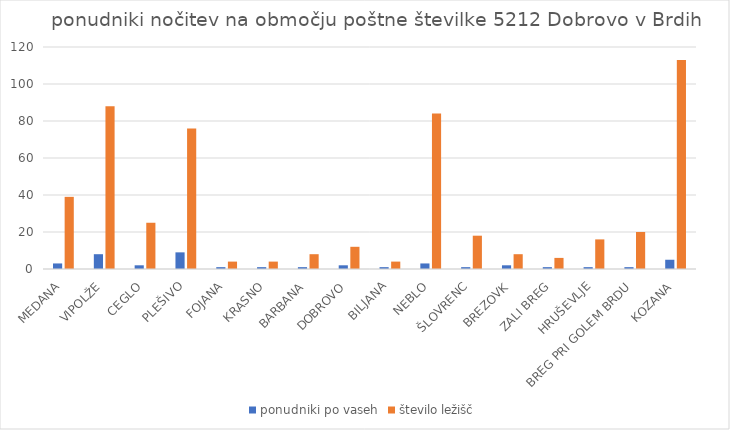
| Category | ponudniki po vaseh | število ležišč |
|---|---|---|
| MEDANA | 3 | 39 |
| VIPOLŽE | 8 | 88 |
| CEGLO | 2 | 25 |
| PLEŠIVO | 9 | 76 |
| FOJANA | 1 | 4 |
| KRASNO | 1 | 4 |
| BARBANA | 1 | 8 |
| DOBROVO | 2 | 12 |
| BILJANA | 1 | 4 |
| NEBLO | 3 | 84 |
| ŠLOVRENC | 1 | 18 |
| BREZOVK | 2 | 8 |
| ZALI BREG | 1 | 6 |
| HRUŠEVLJE | 1 | 16 |
| BREG PRI GOLEM BRDU | 1 | 20 |
| KOZANA | 5 | 113 |